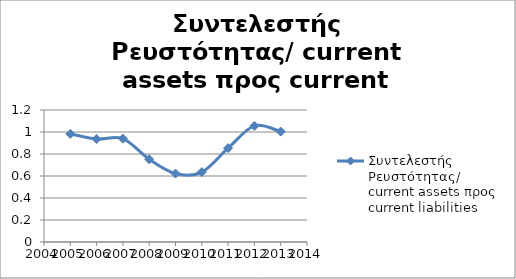
| Category | Συντελεστής Ρευστότητας/ current assets προς current liabilities  |
|---|---|
| 2005.0 | 0.983 |
| 2006.0 | 0.936 |
| 2007.0 | 0.939 |
| 2008.0 | 0.752 |
| 2009.0 | 0.622 |
| 2010.0 | 0.635 |
| 2011.0 | 0.853 |
| 2012.0 | 1.056 |
| 2013.0 | 1.004 |